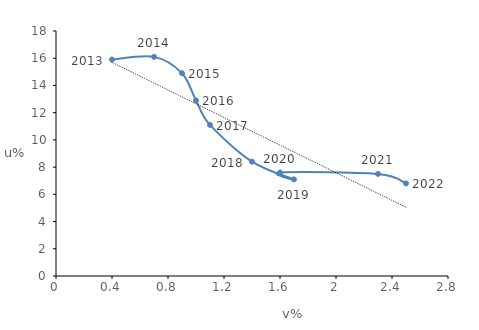
| Category | Ποσοστό ανεργίας |
|---|---|
| 0.4 | 15.9 |
| 0.7 | 16.1 |
| 0.9 | 14.9 |
| 1.0 | 12.9 |
| 1.1 | 11.1 |
| 1.4 | 8.4 |
| 1.7 | 7.1 |
| 1.6 | 7.6 |
| 2.3 | 7.5 |
| 2.5 | 6.8 |